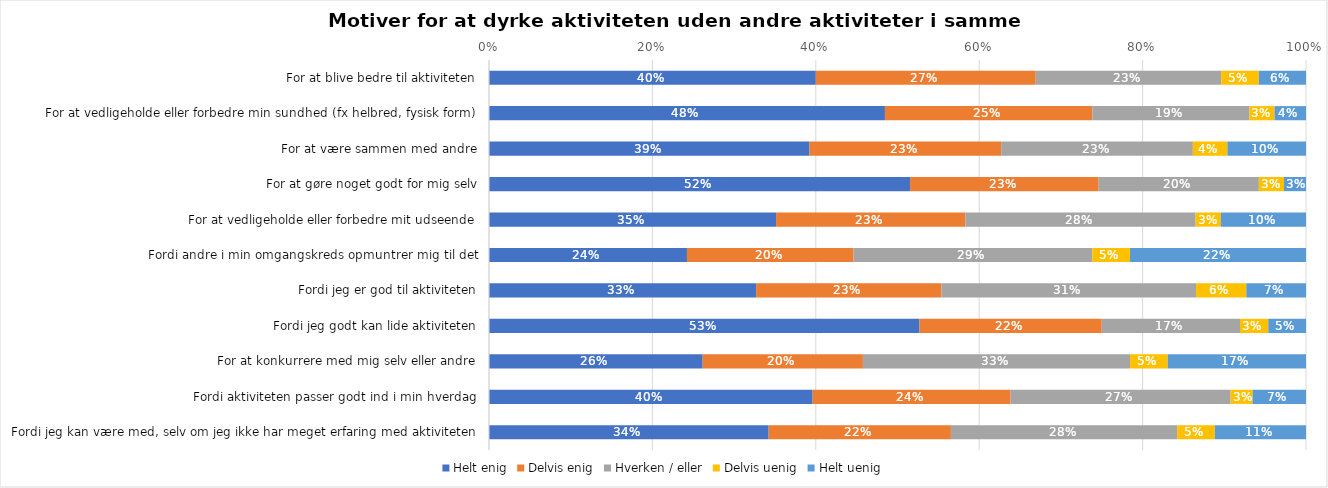
| Category | Helt enig | Delvis enig | Hverken / eller | Delvis uenig | Helt uenig |
|---|---|---|---|---|---|
| For at blive bedre til aktiviteten | 0.4 | 0.269 | 0.227 | 0.046 | 0.058 |
| For at vedligeholde eller forbedre min sundhed (fx helbred, fysisk form) | 0.485 | 0.254 | 0.192 | 0.031 | 0.038 |
| For at være sammen med andre | 0.392 | 0.235 | 0.235 | 0.042 | 0.096 |
| For at gøre noget godt for mig selv | 0.515 | 0.231 | 0.196 | 0.031 | 0.027 |
| For at vedligeholde eller forbedre mit udseende | 0.351 | 0.232 | 0.282 | 0.031 | 0.104 |
| Fordi andre i min omgangskreds opmuntrer mig til det | 0.242 | 0.204 | 0.292 | 0.046 | 0.215 |
| Fordi jeg er god til aktiviteten | 0.327 | 0.227 | 0.312 | 0.062 | 0.073 |
| Fordi jeg godt kan lide aktiviteten | 0.527 | 0.223 | 0.169 | 0.035 | 0.046 |
| For at konkurrere med mig selv eller andre | 0.262 | 0.196 | 0.327 | 0.046 | 0.169 |
| Fordi aktiviteten passer godt ind i min hverdag | 0.396 | 0.242 | 0.269 | 0.027 | 0.065 |
| Fordi jeg kan være med, selv om jeg ikke har meget erfaring med aktiviteten | 0.342 | 0.223 | 0.277 | 0.046 | 0.112 |